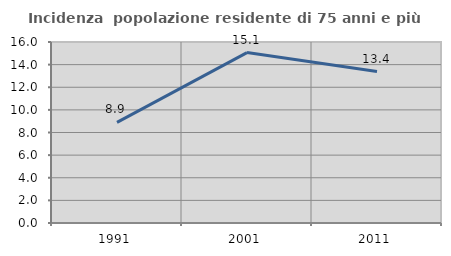
| Category | Incidenza  popolazione residente di 75 anni e più |
|---|---|
| 1991.0 | 8.892 |
| 2001.0 | 15.065 |
| 2011.0 | 13.389 |